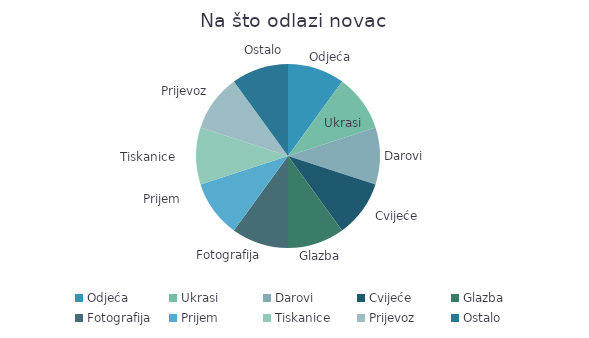
| Category | Iznos |
|---|---|
| Odjeća | 1 |
| Ukrasi | 1 |
| Darovi | 1 |
| Cvijeće | 1 |
| Glazba | 1 |
| Fotografija | 1 |
| Prijem | 1 |
| Tiskanice | 1 |
| Prijevoz | 1 |
| Ostalo | 1 |